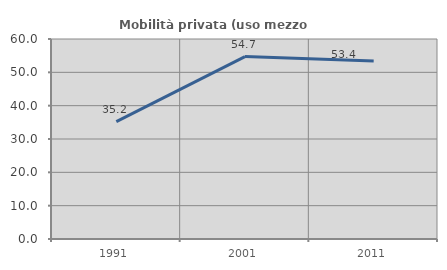
| Category | Mobilità privata (uso mezzo privato) |
|---|---|
| 1991.0 | 35.211 |
| 2001.0 | 54.739 |
| 2011.0 | 53.391 |